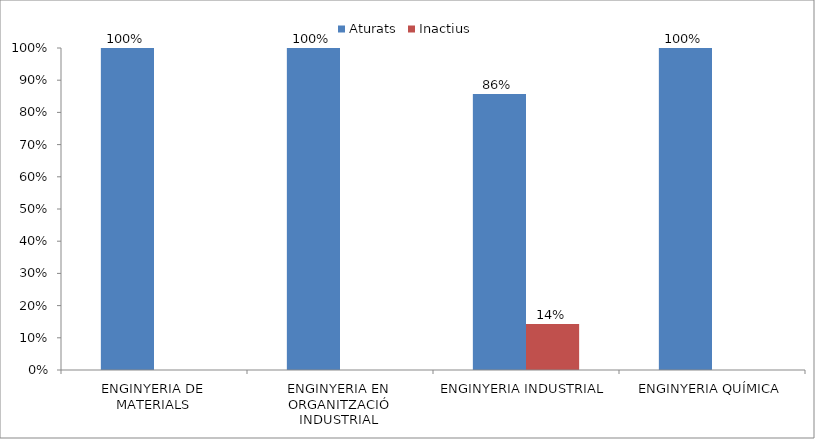
| Category | Aturats | Inactius |
|---|---|---|
| ENGINYERIA DE MATERIALS | 1 | 0 |
| ENGINYERIA EN ORGANITZACIÓ INDUSTRIAL | 1 | 0 |
| ENGINYERIA INDUSTRIAL | 0.857 | 0.143 |
| ENGINYERIA QUÍMICA | 1 | 0 |